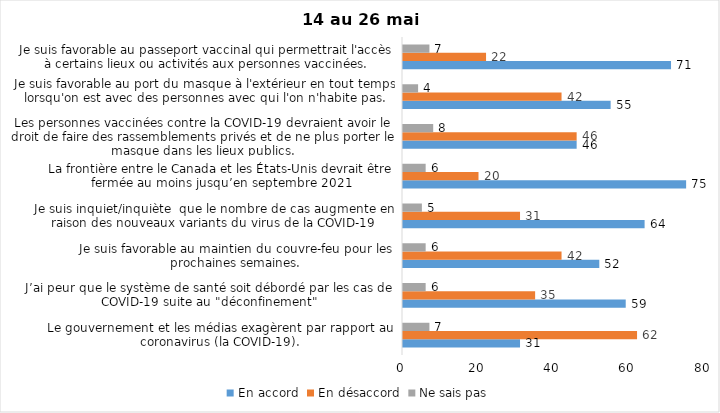
| Category | En accord | En désaccord | Ne sais pas |
|---|---|---|---|
| Le gouvernement et les médias exagèrent par rapport au coronavirus (la COVID-19). | 31 | 62 | 7 |
| J’ai peur que le système de santé soit débordé par les cas de COVID-19 suite au "déconfinement" | 59 | 35 | 6 |
| Je suis favorable au maintien du couvre-feu pour les prochaines semaines. | 52 | 42 | 6 |
| Je suis inquiet/inquiète  que le nombre de cas augmente en raison des nouveaux variants du virus de la COVID-19 | 64 | 31 | 5 |
| La frontière entre le Canada et les États-Unis devrait être fermée au moins jusqu’en septembre 2021 | 75 | 20 | 6 |
| Les personnes vaccinées contre la COVID-19 devraient avoir le droit de faire des rassemblements privés et de ne plus porter le masque dans les lieux publics. | 46 | 46 | 8 |
| Je suis favorable au port du masque à l'extérieur en tout temps lorsqu'on est avec des personnes avec qui l'on n'habite pas. | 55 | 42 | 4 |
| Je suis favorable au passeport vaccinal qui permettrait l'accès à certains lieux ou activités aux personnes vaccinées. | 71 | 22 | 7 |